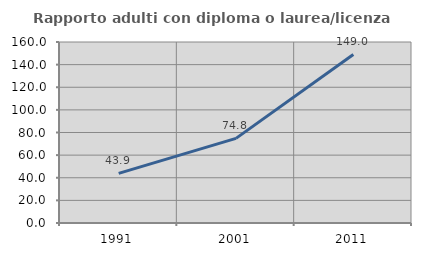
| Category | Rapporto adulti con diploma o laurea/licenza media  |
|---|---|
| 1991.0 | 43.865 |
| 2001.0 | 74.824 |
| 2011.0 | 149.008 |